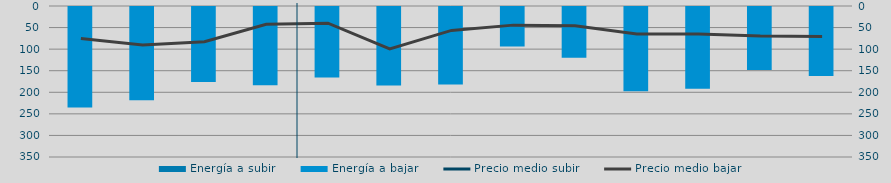
| Category | Energía a subir | Energía a bajar |
|---|---|---|
| S |  | 234.984 |
| O |  | 218.689 |
| N |  | 176.116 |
| D |  | 183.605 |
| E |  | 165.84 |
| F |  | 184.155 |
| M |  | 182.05 |
| A |  | 93.896 |
| M |  | 120.063 |
| J |  | 197.687 |
| J |  | 191.747 |
| A |  | 148.51 |
| S |  | 162.496 |